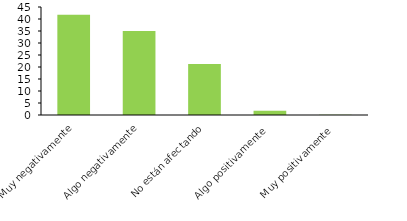
| Category | Series 0 |
|---|---|
| Muy negativamente | 41.8 |
| Algo negativamente | 35 |
| No están afectando | 21.3 |
| Algo positivamente | 1.8 |
| Muy positivamente | 0.1 |